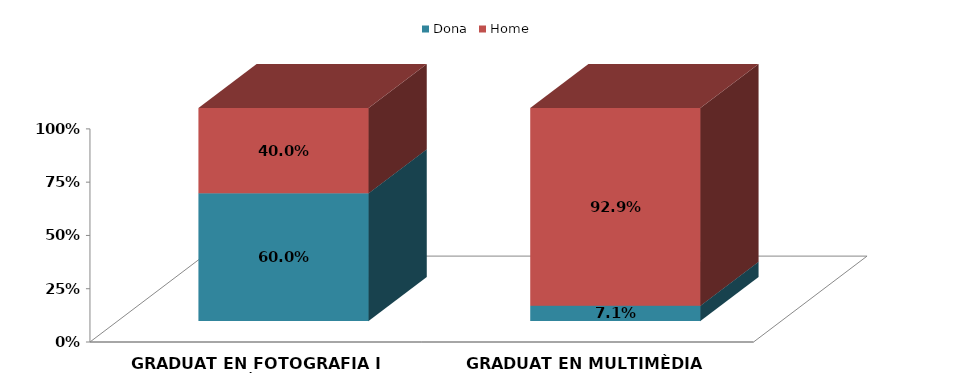
| Category | Dona | Home |
|---|---|---|
| GRADUAT EN FOTOGRAFIA I CREACIÓ DIGITAL | 0.6 | 0.4 |
| GRADUAT EN MULTIMÈDIA | 0.071 | 0.929 |